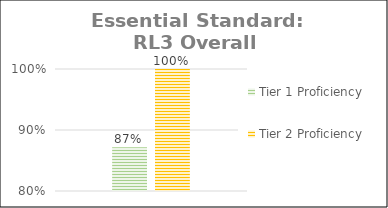
| Category | Tier 1 Proficiency | Tier 2 Proficiency |
|---|---|---|
| 0 | 0.872 | 1 |